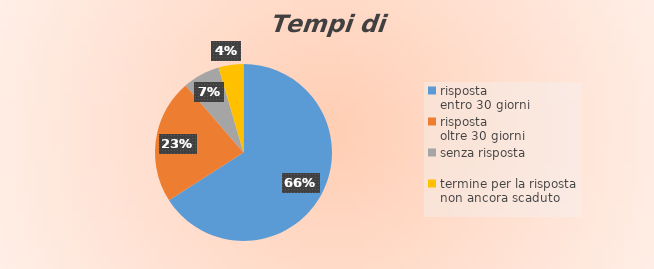
| Category | Series 0 |
|---|---|
| risposta
entro 30 giorni | 29 |
| risposta
oltre 30 giorni | 10 |
| senza risposta | 3 |
| termine per la risposta non ancora scaduto | 2 |